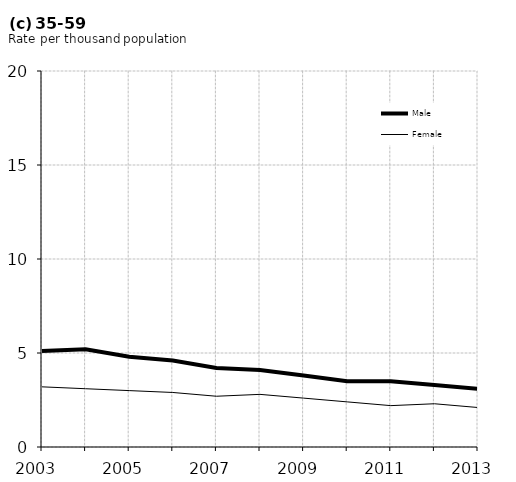
| Category | Male | Female |
|---|---|---|
| 2003.0 | 5.1 | 3.2 |
| 2004.0 | 5.2 | 3.1 |
| 2005.0 | 4.8 | 3 |
| 2006.0 | 4.6 | 2.9 |
| 2007.0 | 4.2 | 2.7 |
| 2008.0 | 4.1 | 2.8 |
| 2009.0 | 3.8 | 2.6 |
| 2010.0 | 3.5 | 2.4 |
| 2011.0 | 3.5 | 2.2 |
| 2012.0 | 3.3 | 2.3 |
| 2013.0 | 3.1 | 2.1 |